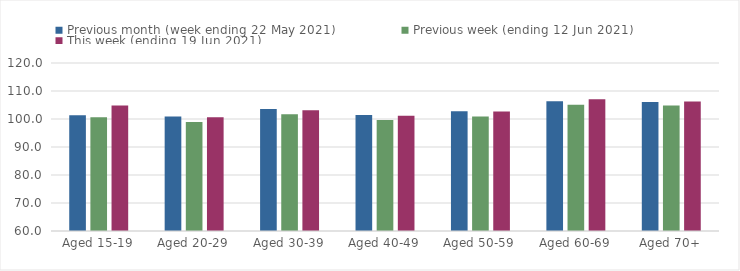
| Category | Previous month (week ending 22 May 2021) | Previous week (ending 12 Jun 2021) | This week (ending 19 Jun 2021) |
|---|---|---|---|
| Aged 15-19 | 101.37 | 100.63 | 104.78 |
| Aged 20-29 | 100.89 | 98.92 | 100.6 |
| Aged 30-39 | 103.53 | 101.74 | 103.12 |
| Aged 40-49 | 101.43 | 99.63 | 101.14 |
| Aged 50-59 | 102.74 | 100.91 | 102.69 |
| Aged 60-69 | 106.35 | 105.1 | 107.09 |
| Aged 70+ | 106.04 | 104.78 | 106.29 |